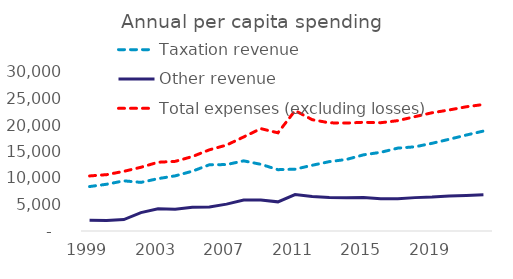
| Category |  Taxation revenue  |  Other revenue  |  Total expenses (excluding losses)  |
|---|---|---|---|
| 1999-06-01 | 8384.658 | 2036.341 | 10387.623 |
| 2000-06-01 | 8822.615 | 1964.001 | 10632.747 |
| 2001-06-01 | 9466.821 | 2155.534 | 11256.029 |
| 2002-06-01 | 9171.837 | 3477.944 | 12023.919 |
| 2003-06-01 | 9879.072 | 4177.968 | 12972.937 |
| 2004-06-01 | 10405.382 | 4095.14 | 13137.068 |
| 2005-06-01 | 11278.454 | 4476.886 | 14044.123 |
| 2006-06-01 | 12500.747 | 4511.271 | 15317.483 |
| 2007-06-01 | 12533.086 | 5069.06 | 16214.789 |
| 2008-06-01 | 13233.64 | 5836.728 | 17747.051 |
| 2009-06-01 | 12584.281 | 5826.723 | 19315.807 |
| 2010-06-01 | 11572.241 | 5497.774 | 18521.515 |
| 2011-06-01 | 11662.489 | 6862.273 | 22720.958 |
| 2012-06-01 | 12401.372 | 6506.608 | 21004.179 |
| 2013-06-01 | 13087.053 | 6343.171 | 20409.941 |
| 2014-06-01 | 13499.598 | 6279.811 | 20365.48 |
| 2015-06-01 | 14373.062 | 6301.039 | 20512.865 |
| 2016-06-01 | 14845.088 | 6070.957 | 20430.428 |
| 2017-06-01 | 15639.25 | 6102.338 | 20820.626 |
| 2018-06-01 | 15882.58 | 6297.43 | 21573.353 |
| 2019-06-01 | 16546.823 | 6419.494 | 22309.929 |
| 2020-06-01 | 17308.27 | 6614.264 | 22837.361 |
| 2021-06-01 | 18106.535 | 6707.332 | 23440.09 |
| 2022-06-01 | 18856.962 | 6821.989 | 23870.838 |